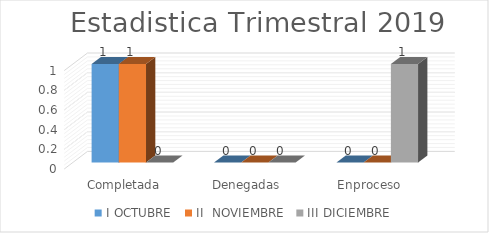
| Category | I OCTUBRE  | II  NOVIEMBRE  | III DICIEMBRE |
|---|---|---|---|
| Completada | 1 | 1 | 0 |
| Denegadas | 0 | 0 | 0 |
| Enproceso | 0 | 0 | 1 |